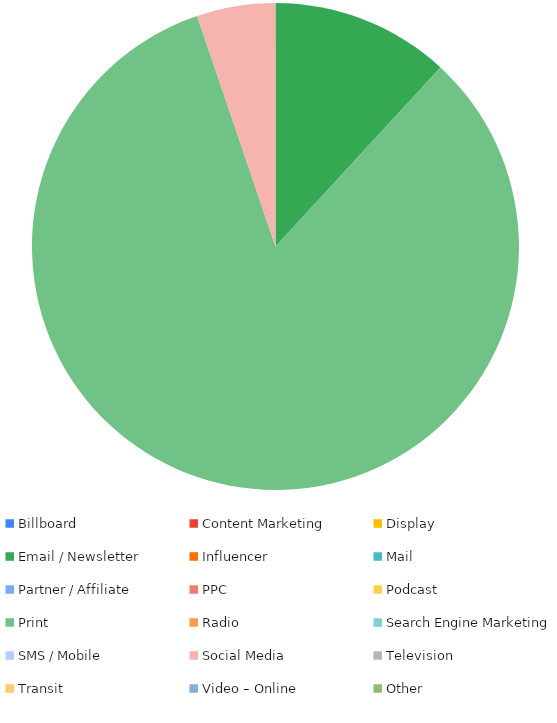
| Category | Series 0 |
|---|---|
| Billboard | 0 |
| Content Marketing | 0 |
| Display | 0 |
| Email / Newsletter | 50 |
| Influencer | 0 |
| Mail | 0 |
| Partner / Affiliate | 0 |
| PPC | 0 |
| Podcast | 0 |
| Print | 350 |
| Radio | 0 |
| Search Engine Marketing | 0 |
| SMS / Mobile | 0 |
| Social Media | 22 |
| Television | 0 |
| Transit | 0 |
| Video – Online | 0 |
| Other | 0 |